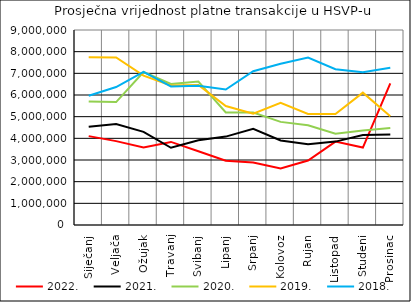
| Category | 2022. | 2021. | 2020. | 2019. | 2018. |
|---|---|---|---|---|---|
| Siječanj | 4102310.943 | 4530178.981 | 5699758.69 | 7742535.146 | 5966679.792 |
| Veljača | 3871386.122 | 4665171.186 | 5673285.034 | 7734624.833 | 6366377.059 |
| Ožujak | 3579454.547 | 4301175.464 | 7058817.156 | 6894159.499 | 7064715.299 |
| Travanj | 3834971.212 | 3565134.984 | 6507707.898 | 6438790.422 | 6397962.706 |
| Svibanj | 3401248.277 | 3911025.963 | 6619433.843 | 6457874.641 | 6425351.087 |
| Lipanj | 2966166.989 | 4079938.575 | 5191043.289 | 5491833.077 | 6253381.595 |
| Srpanj | 2881849.369 | 4441455.501 | 5193515.14 | 5133651.328 | 7098051.057 |
| Kolovoz | 2604491.86 | 3902111.081 | 4759903.069 | 5642331.662 | 7437951.621 |
| Rujan | 2977453.002 | 3723183.454 | 4601236.871 | 5128076.36 | 7723977.841 |
| Listopad | 3851154.62 | 3848666.567 | 4212388.207 | 5119829.359 | 7191477.14 |
| Studeni | 3574091.479 | 4153032.23 | 4363838.912 | 6109824.975 | 7052554.697 |
| Prosinac | 6534277.364 | 4181073.802 | 4472752.532 | 5021146.857 | 7257418.22 |